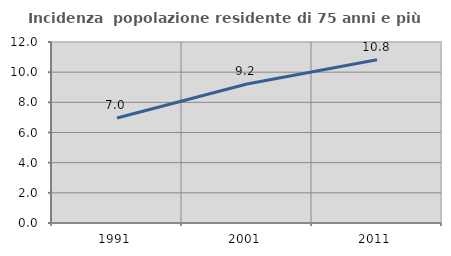
| Category | Incidenza  popolazione residente di 75 anni e più |
|---|---|
| 1991.0 | 6.966 |
| 2001.0 | 9.217 |
| 2011.0 | 10.818 |